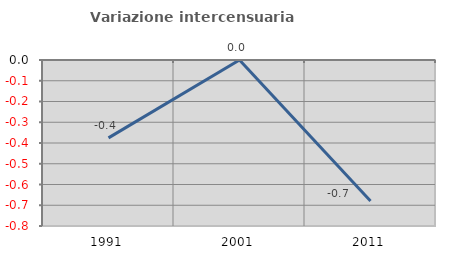
| Category | Variazione intercensuaria annua |
|---|---|
| 1991.0 | -0.375 |
| 2001.0 | 0 |
| 2011.0 | -0.679 |